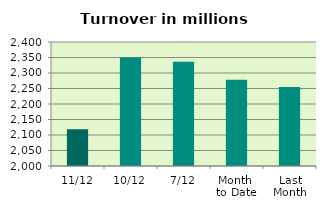
| Category | Series 0 |
|---|---|
| 11/12 | 2118.536 |
| 10/12 | 2349.685 |
| 7/12 | 2336.289 |
| Month 
to Date | 2278.143 |
| Last
Month | 2254.707 |